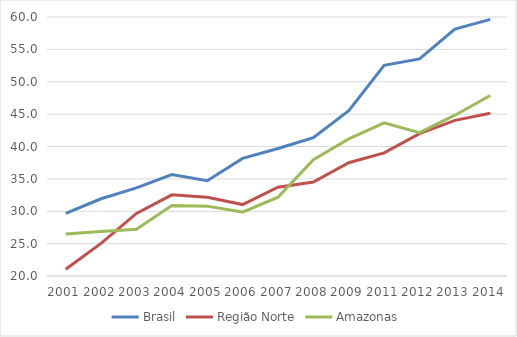
| Category | Brasil | Região Norte | Amazonas |
|---|---|---|---|
| 2001.0 | 29.688 | 21.054 | 26.471 |
| 2002.0 | 31.93 | 25.043 | 26.883 |
| 2003.0 | 33.607 | 29.661 | 27.217 |
| 2004.0 | 35.677 | 32.53 | 30.896 |
| 2005.0 | 34.718 | 32.17 | 30.789 |
| 2006.0 | 38.163 | 31.034 | 29.869 |
| 2007.0 | 39.695 | 33.709 | 32.175 |
| 2008.0 | 41.365 | 34.518 | 37.964 |
| 2009.0 | 45.537 | 37.501 | 41.181 |
| 2011.0 | 52.531 | 39.009 | 43.661 |
| 2012.0 | 53.525 | 41.987 | 42.141 |
| 2013.0 | 58.121 | 44.035 | 44.831 |
| 2014.0 | 59.64 | 45.121 | 47.883 |